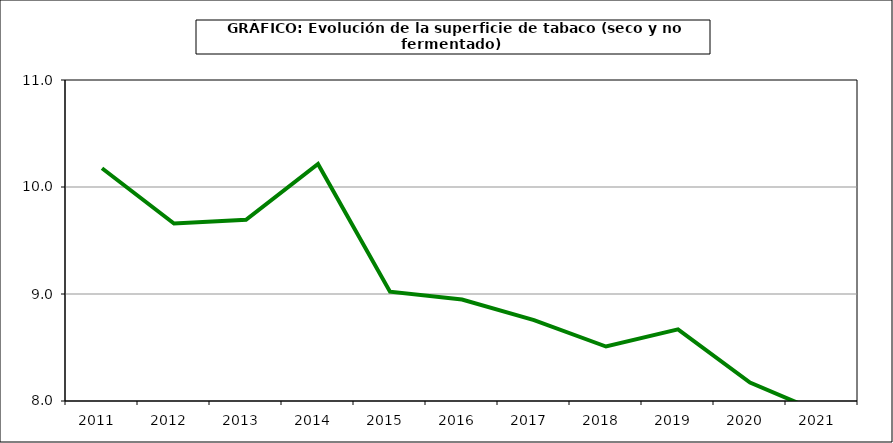
| Category | Superficie |
|---|---|
| 2011.0 | 10.175 |
| 2012.0 | 9.659 |
| 2013.0 | 9.693 |
| 2014.0 | 10.215 |
| 2015.0 | 9.022 |
| 2016.0 | 8.949 |
| 2017.0 | 8.756 |
| 2018.0 | 8.509 |
| 2019.0 | 8.67 |
| 2020.0 | 8.172 |
| 2021.0 | 7.887 |